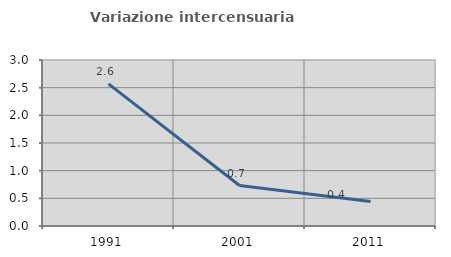
| Category | Variazione intercensuaria annua |
|---|---|
| 1991.0 | 2.569 |
| 2001.0 | 0.731 |
| 2011.0 | 0.445 |